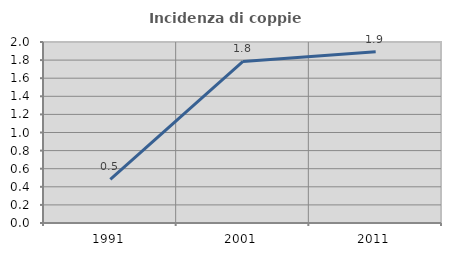
| Category | Incidenza di coppie miste |
|---|---|
| 1991.0 | 0.483 |
| 2001.0 | 1.785 |
| 2011.0 | 1.893 |